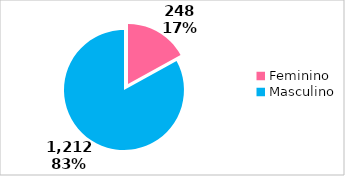
| Category | Qtde |
|---|---|
| Feminino | 248 |
| Masculino | 1212 |